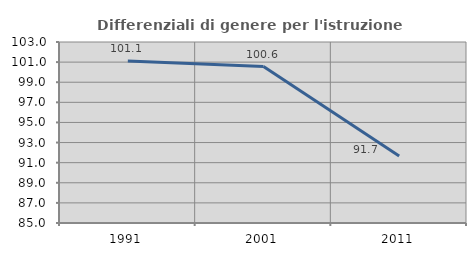
| Category | Differenziali di genere per l'istruzione superiore |
|---|---|
| 1991.0 | 101.114 |
| 2001.0 | 100.553 |
| 2011.0 | 91.655 |